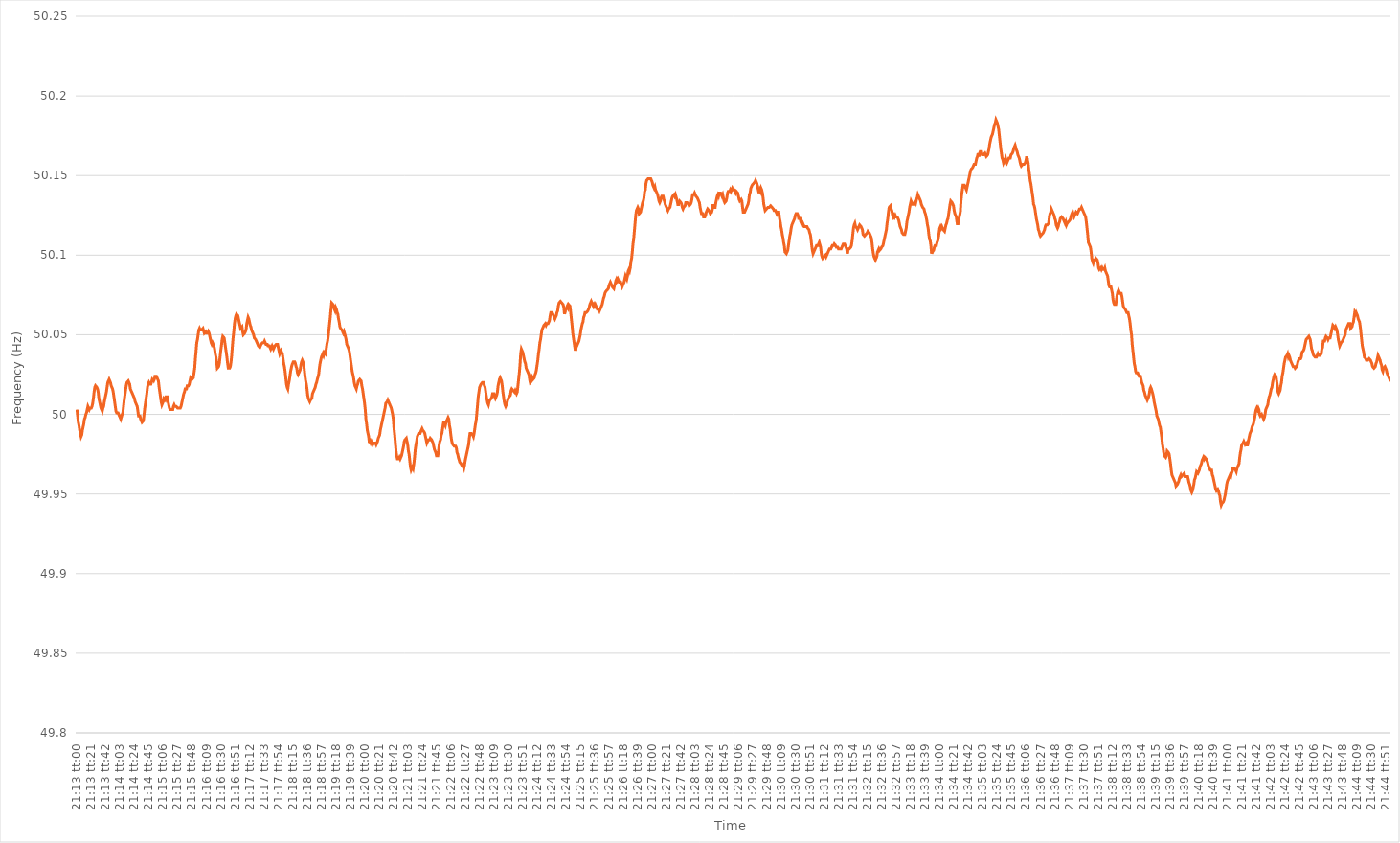
| Category | Series 0 |
|---|---|
| 0.8840277777777777 | 50.003 |
| 0.8840393518518518 | 49.999 |
| 0.8840509259259259 | 49.995 |
| 0.8840625000000001 | 49.993 |
| 0.884074074074074 | 49.99 |
| 0.8840856481481482 | 49.988 |
| 0.8840972222222222 | 49.986 |
| 0.8841087962962964 | 49.987 |
| 0.8841203703703703 | 49.99 |
| 0.8841319444444444 | 49.992 |
| 0.8841435185185186 | 49.994 |
| 0.8841550925925926 | 49.997 |
| 0.8841666666666667 | 49.998 |
| 0.8841782407407407 | 50 |
| 0.8841898148148148 | 50.001 |
| 0.884201388888889 | 50.003 |
| 0.8842129629629629 | 50.005 |
| 0.8842245370370371 | 50.005 |
| 0.8842361111111111 | 50.003 |
| 0.8842476851851852 | 50.004 |
| 0.8842592592592592 | 50.004 |
| 0.8842708333333333 | 50.004 |
| 0.8842824074074075 | 50.005 |
| 0.8842939814814814 | 50.007 |
| 0.8843055555555556 | 50.01 |
| 0.8843171296296296 | 50.014 |
| 0.8843287037037038 | 50.017 |
| 0.8843402777777777 | 50.018 |
| 0.8843518518518518 | 50.018 |
| 0.884363425925926 | 50.017 |
| 0.884375 | 50.016 |
| 0.8843865740740741 | 50.014 |
| 0.8843981481481481 | 50.01 |
| 0.8844097222222222 | 50.008 |
| 0.8844212962962964 | 50.006 |
| 0.8844328703703703 | 50.004 |
| 0.8844444444444445 | 50.003 |
| 0.8844560185185185 | 50.002 |
| 0.8844675925925927 | 50.004 |
| 0.8844791666666666 | 50.005 |
| 0.8844907407407407 | 50.008 |
| 0.8845023148148149 | 50.01 |
| 0.8845138888888888 | 50.012 |
| 0.884525462962963 | 50.014 |
| 0.884537037037037 | 50.017 |
| 0.8845486111111112 | 50.02 |
| 0.8845601851851851 | 50.021 |
| 0.8845717592592592 | 50.022 |
| 0.8845833333333334 | 50.021 |
| 0.8845949074074074 | 50.02 |
| 0.8846064814814815 | 50.018 |
| 0.8846180555555555 | 50.017 |
| 0.8846296296296297 | 50.016 |
| 0.8846412037037038 | 50.014 |
| 0.8846527777777777 | 50.011 |
| 0.8846643518518519 | 50.008 |
| 0.8846759259259259 | 50.005 |
| 0.8846875000000001 | 50.002 |
| 0.884699074074074 | 50.001 |
| 0.8847106481481481 | 50.001 |
| 0.8847222222222223 | 50.001 |
| 0.8847337962962962 | 50.001 |
| 0.8847453703703704 | 49.999 |
| 0.8847569444444444 | 49.998 |
| 0.8847685185185186 | 49.997 |
| 0.8847800925925925 | 49.997 |
| 0.8847916666666666 | 50 |
| 0.8848032407407408 | 50.001 |
| 0.8848148148148148 | 50.005 |
| 0.8848263888888889 | 50.009 |
| 0.8848379629629629 | 50.012 |
| 0.8848495370370371 | 50.015 |
| 0.8848611111111112 | 50.018 |
| 0.8848726851851851 | 50.02 |
| 0.8848842592592593 | 50.02 |
| 0.8848958333333333 | 50.021 |
| 0.8849074074074075 | 50.021 |
| 0.8849189814814814 | 50.019 |
| 0.8849305555555556 | 50.016 |
| 0.8849421296296297 | 50.015 |
| 0.8849537037037036 | 50.014 |
| 0.8849652777777778 | 50.014 |
| 0.8849768518518518 | 50.012 |
| 0.884988425925926 | 50.011 |
| 0.8849999999999999 | 50.01 |
| 0.885011574074074 | 50.008 |
| 0.8850231481481482 | 50.008 |
| 0.8850347222222222 | 50.006 |
| 0.8850462962962963 | 50.005 |
| 0.8850578703703703 | 50.002 |
| 0.8850694444444445 | 49.999 |
| 0.8850810185185186 | 49.999 |
| 0.8850925925925925 | 49.999 |
| 0.8851041666666667 | 49.997 |
| 0.8851157407407407 | 49.996 |
| 0.8851273148148149 | 49.995 |
| 0.8851388888888888 | 49.995 |
| 0.885150462962963 | 49.996 |
| 0.8851620370370371 | 50 |
| 0.8851736111111111 | 50.004 |
| 0.8851851851851852 | 50.007 |
| 0.8851967592592592 | 50.01 |
| 0.8852083333333334 | 50.013 |
| 0.8852199074074073 | 50.017 |
| 0.8852314814814815 | 50.019 |
| 0.8852430555555556 | 50.02 |
| 0.8852546296296296 | 50.019 |
| 0.8852662037037037 | 50.019 |
| 0.8852777777777777 | 50.019 |
| 0.8852893518518519 | 50.019 |
| 0.885300925925926 | 50.022 |
| 0.8853125 | 50.022 |
| 0.8853240740740741 | 50.021 |
| 0.8853356481481481 | 50.022 |
| 0.8853472222222223 | 50.024 |
| 0.8853587962962962 | 50.024 |
| 0.8853703703703704 | 50.024 |
| 0.8853819444444445 | 50.023 |
| 0.8853935185185186 | 50.023 |
| 0.8854050925925926 | 50.021 |
| 0.8854166666666666 | 50.017 |
| 0.8854282407407408 | 50.014 |
| 0.8854398148148147 | 50.011 |
| 0.8854513888888889 | 50.008 |
| 0.885462962962963 | 50.006 |
| 0.885474537037037 | 50.006 |
| 0.8854861111111111 | 50.008 |
| 0.8854976851851851 | 50.01 |
| 0.8855092592592593 | 50.01 |
| 0.8855208333333334 | 50.009 |
| 0.8855324074074074 | 50.011 |
| 0.8855439814814815 | 50.011 |
| 0.8855555555555555 | 50.011 |
| 0.8855671296296297 | 50.008 |
| 0.8855787037037036 | 50.006 |
| 0.8855902777777778 | 50.004 |
| 0.8856018518518519 | 50.003 |
| 0.885613425925926 | 50.003 |
| 0.885625 | 50.003 |
| 0.885636574074074 | 50.003 |
| 0.8856481481481482 | 50.003 |
| 0.8856597222222221 | 50.005 |
| 0.8856712962962963 | 50.006 |
| 0.8856828703703704 | 50.005 |
| 0.8856944444444445 | 50.005 |
| 0.8857060185185185 | 50.005 |
| 0.8857175925925925 | 50.005 |
| 0.8857291666666667 | 50.004 |
| 0.8857407407407408 | 50.004 |
| 0.8857523148148148 | 50.004 |
| 0.8857638888888889 | 50.004 |
| 0.885775462962963 | 50.004 |
| 0.8857870370370371 | 50.005 |
| 0.885798611111111 | 50.007 |
| 0.8858101851851852 | 50.009 |
| 0.8858217592592593 | 50.011 |
| 0.8858333333333334 | 50.013 |
| 0.8858449074074074 | 50.014 |
| 0.8858564814814814 | 50.016 |
| 0.8858680555555556 | 50.016 |
| 0.8858796296296297 | 50.016 |
| 0.8858912037037037 | 50.018 |
| 0.8859027777777778 | 50.018 |
| 0.8859143518518519 | 50.018 |
| 0.8859259259259259 | 50.019 |
| 0.8859374999999999 | 50.021 |
| 0.8859490740740741 | 50.023 |
| 0.8859606481481482 | 50.023 |
| 0.8859722222222222 | 50.022 |
| 0.8859837962962963 | 50.022 |
| 0.8859953703703703 | 50.023 |
| 0.8860069444444445 | 50.026 |
| 0.8860185185185184 | 50.029 |
| 0.8860300925925926 | 50.035 |
| 0.8860416666666667 | 50.04 |
| 0.8860532407407408 | 50.045 |
| 0.8860648148148148 | 50.047 |
| 0.8860763888888888 | 50.05 |
| 0.886087962962963 | 50.053 |
| 0.8860995370370371 | 50.054 |
| 0.8861111111111111 | 50.053 |
| 0.8861226851851852 | 50.053 |
| 0.8861342592592593 | 50.053 |
| 0.8861458333333333 | 50.053 |
| 0.8861574074074073 | 50.054 |
| 0.8861689814814815 | 50.054 |
| 0.8861805555555556 | 50.051 |
| 0.8861921296296296 | 50.051 |
| 0.8862037037037037 | 50.052 |
| 0.8862152777777778 | 50.051 |
| 0.8862268518518519 | 50.051 |
| 0.8862384259259258 | 50.051 |
| 0.88625 | 50.052 |
| 0.8862615740740741 | 50.051 |
| 0.8862731481481482 | 50.049 |
| 0.8862847222222222 | 50.047 |
| 0.8862962962962962 | 50.045 |
| 0.8863078703703704 | 50.044 |
| 0.8863194444444445 | 50.045 |
| 0.8863310185185185 | 50.044 |
| 0.8863425925925926 | 50.043 |
| 0.8863541666666667 | 50.041 |
| 0.8863657407407407 | 50.038 |
| 0.8863773148148147 | 50.036 |
| 0.8863888888888889 | 50.033 |
| 0.886400462962963 | 50.029 |
| 0.886412037037037 | 50.029 |
| 0.8864236111111111 | 50.03 |
| 0.8864351851851852 | 50.032 |
| 0.8864467592592593 | 50.036 |
| 0.8864583333333332 | 50.04 |
| 0.8864699074074074 | 50.043 |
| 0.8864814814814815 | 50.047 |
| 0.8864930555555556 | 50.049 |
| 0.8865046296296296 | 50.049 |
| 0.8865162037037037 | 50.048 |
| 0.8865277777777778 | 50.045 |
| 0.886539351851852 | 50.042 |
| 0.8865509259259259 | 50.039 |
| 0.8865625 | 50.036 |
| 0.8865740740740741 | 50.032 |
| 0.8865856481481482 | 50.029 |
| 0.8865972222222221 | 50.029 |
| 0.8866087962962963 | 50.029 |
| 0.8866203703703704 | 50.03 |
| 0.8866319444444444 | 50.033 |
| 0.8866435185185185 | 50.037 |
| 0.8866550925925926 | 50.043 |
| 0.8866666666666667 | 50.048 |
| 0.8866782407407406 | 50.052 |
| 0.8866898148148148 | 50.057 |
| 0.8867013888888889 | 50.06 |
| 0.886712962962963 | 50.062 |
| 0.886724537037037 | 50.063 |
| 0.8867361111111111 | 50.063 |
| 0.8867476851851852 | 50.062 |
| 0.8867592592592594 | 50.06 |
| 0.8867708333333333 | 50.058 |
| 0.8867824074074074 | 50.056 |
| 0.8867939814814815 | 50.054 |
| 0.8868055555555556 | 50.054 |
| 0.8868171296296296 | 50.055 |
| 0.8868287037037037 | 50.052 |
| 0.8868402777777779 | 50.05 |
| 0.8868518518518518 | 50.05 |
| 0.8868634259259259 | 50.051 |
| 0.886875 | 50.051 |
| 0.8868865740740741 | 50.053 |
| 0.886898148148148 | 50.057 |
| 0.8869097222222222 | 50.059 |
| 0.8869212962962963 | 50.061 |
| 0.8869328703703704 | 50.06 |
| 0.8869444444444444 | 50.058 |
| 0.8869560185185185 | 50.056 |
| 0.8869675925925926 | 50.055 |
| 0.8869791666666668 | 50.053 |
| 0.8869907407407407 | 50.052 |
| 0.8870023148148148 | 50.051 |
| 0.8870138888888889 | 50.05 |
| 0.887025462962963 | 50.048 |
| 0.887037037037037 | 50.048 |
| 0.8870486111111111 | 50.047 |
| 0.8870601851851853 | 50.046 |
| 0.8870717592592593 | 50.046 |
| 0.8870833333333333 | 50.044 |
| 0.8870949074074074 | 50.043 |
| 0.8871064814814815 | 50.043 |
| 0.8871180555555555 | 50.042 |
| 0.8871296296296296 | 50.043 |
| 0.8871412037037038 | 50.044 |
| 0.8871527777777778 | 50.044 |
| 0.8871643518518518 | 50.045 |
| 0.8871759259259259 | 50.045 |
| 0.8871875 | 50.045 |
| 0.8871990740740742 | 50.046 |
| 0.8872106481481481 | 50.045 |
| 0.8872222222222222 | 50.044 |
| 0.8872337962962963 | 50.044 |
| 0.8872453703703704 | 50.044 |
| 0.8872569444444444 | 50.043 |
| 0.8872685185185185 | 50.043 |
| 0.8872800925925927 | 50.043 |
| 0.8872916666666667 | 50.043 |
| 0.8873032407407407 | 50.041 |
| 0.8873148148148148 | 50.041 |
| 0.8873263888888889 | 50.043 |
| 0.8873379629629629 | 50.042 |
| 0.887349537037037 | 50.041 |
| 0.8873611111111112 | 50.042 |
| 0.8873726851851852 | 50.043 |
| 0.8873842592592592 | 50.043 |
| 0.8873958333333333 | 50.044 |
| 0.8874074074074074 | 50.044 |
| 0.8874189814814816 | 50.044 |
| 0.8874305555555555 | 50.042 |
| 0.8874421296296297 | 50.04 |
| 0.8874537037037037 | 50.038 |
| 0.8874652777777778 | 50.039 |
| 0.8874768518518518 | 50.04 |
| 0.8874884259259259 | 50.04 |
| 0.8875000000000001 | 50.038 |
| 0.8875115740740741 | 50.035 |
| 0.8875231481481481 | 50.032 |
| 0.8875347222222222 | 50.03 |
| 0.8875462962962963 | 50.027 |
| 0.8875578703703703 | 50.023 |
| 0.8875694444444444 | 50.019 |
| 0.8875810185185186 | 50.017 |
| 0.8875925925925926 | 50.016 |
| 0.8876041666666666 | 50.019 |
| 0.8876157407407407 | 50.021 |
| 0.8876273148148148 | 50.024 |
| 0.887638888888889 | 50.027 |
| 0.8876504629629629 | 50.029 |
| 0.887662037037037 | 50.031 |
| 0.8876736111111111 | 50.032 |
| 0.8876851851851852 | 50.033 |
| 0.8876967592592592 | 50.033 |
| 0.8877083333333333 | 50.033 |
| 0.8877199074074075 | 50.032 |
| 0.8877314814814815 | 50.03 |
| 0.8877430555555555 | 50.029 |
| 0.8877546296296296 | 50.026 |
| 0.8877662037037037 | 50.025 |
| 0.8877777777777777 | 50.025 |
| 0.8877893518518518 | 50.027 |
| 0.887800925925926 | 50.028 |
| 0.8878125 | 50.031 |
| 0.887824074074074 | 50.033 |
| 0.8878356481481481 | 50.034 |
| 0.8878472222222222 | 50.034 |
| 0.8878587962962964 | 50.032 |
| 0.8878703703703703 | 50.028 |
| 0.8878819444444445 | 50.024 |
| 0.8878935185185185 | 50.021 |
| 0.8879050925925926 | 50.019 |
| 0.8879166666666666 | 50.016 |
| 0.8879282407407407 | 50.012 |
| 0.8879398148148149 | 50.01 |
| 0.8879513888888889 | 50.009 |
| 0.887962962962963 | 50.008 |
| 0.887974537037037 | 50.009 |
| 0.8879861111111111 | 50.009 |
| 0.8879976851851853 | 50.01 |
| 0.8880092592592592 | 50.013 |
| 0.8880208333333334 | 50.013 |
| 0.8880324074074074 | 50.015 |
| 0.8880439814814814 | 50.016 |
| 0.8880555555555555 | 50.017 |
| 0.8880671296296296 | 50.019 |
| 0.8880787037037038 | 50.02 |
| 0.8880902777777777 | 50.022 |
| 0.8881018518518519 | 50.022 |
| 0.8881134259259259 | 50.025 |
| 0.888125 | 50.029 |
| 0.888136574074074 | 50.032 |
| 0.8881481481481481 | 50.034 |
| 0.8881597222222223 | 50.036 |
| 0.8881712962962963 | 50.037 |
| 0.8881828703703704 | 50.038 |
| 0.8881944444444444 | 50.037 |
| 0.8882060185185185 | 50.039 |
| 0.8882175925925927 | 50.039 |
| 0.8882291666666666 | 50.038 |
| 0.8882407407407408 | 50.041 |
| 0.8882523148148148 | 50.044 |
| 0.888263888888889 | 50.046 |
| 0.8882754629629629 | 50.049 |
| 0.888287037037037 | 50.053 |
| 0.8882986111111112 | 50.057 |
| 0.8883101851851851 | 50.061 |
| 0.8883217592592593 | 50.066 |
| 0.8883333333333333 | 50.07 |
| 0.8883449074074075 | 50.07 |
| 0.8883564814814814 | 50.069 |
| 0.8883680555555555 | 50.068 |
| 0.8883796296296297 | 50.066 |
| 0.8883912037037037 | 50.065 |
| 0.8884027777777778 | 50.067 |
| 0.8884143518518518 | 50.066 |
| 0.888425925925926 | 50.064 |
| 0.8884375000000001 | 50.063 |
| 0.888449074074074 | 50.06 |
| 0.8884606481481482 | 50.058 |
| 0.8884722222222222 | 50.055 |
| 0.8884837962962964 | 50.054 |
| 0.8884953703703703 | 50.054 |
| 0.8885069444444444 | 50.053 |
| 0.8885185185185186 | 50.052 |
| 0.8885300925925925 | 50.051 |
| 0.8885416666666667 | 50.052 |
| 0.8885532407407407 | 50.052 |
| 0.8885648148148149 | 50.049 |
| 0.8885763888888888 | 50.047 |
| 0.8885879629629629 | 50.044 |
| 0.8885995370370371 | 50.043 |
| 0.8886111111111111 | 50.042 |
| 0.8886226851851852 | 50.041 |
| 0.8886342592592592 | 50.039 |
| 0.8886458333333334 | 50.036 |
| 0.8886574074074075 | 50.033 |
| 0.8886689814814814 | 50.03 |
| 0.8886805555555556 | 50.027 |
| 0.8886921296296296 | 50.025 |
| 0.8887037037037038 | 50.023 |
| 0.8887152777777777 | 50.02 |
| 0.8887268518518519 | 50.018 |
| 0.888738425925926 | 50.017 |
| 0.8887499999999999 | 50.016 |
| 0.8887615740740741 | 50.018 |
| 0.8887731481481481 | 50.019 |
| 0.8887847222222223 | 50.021 |
| 0.8887962962962962 | 50.021 |
| 0.8888078703703703 | 50.022 |
| 0.8888194444444445 | 50.022 |
| 0.8888310185185185 | 50.021 |
| 0.8888425925925926 | 50.018 |
| 0.8888541666666666 | 50.016 |
| 0.8888657407407408 | 50.013 |
| 0.8888773148148149 | 50.01 |
| 0.8888888888888888 | 50.007 |
| 0.888900462962963 | 50.003 |
| 0.888912037037037 | 49.997 |
| 0.8889236111111112 | 49.994 |
| 0.8889351851851851 | 49.99 |
| 0.8889467592592593 | 49.988 |
| 0.8889583333333334 | 49.986 |
| 0.8889699074074073 | 49.982 |
| 0.8889814814814815 | 49.983 |
| 0.8889930555555555 | 49.982 |
| 0.8890046296296297 | 49.983 |
| 0.8890162037037036 | 49.982 |
| 0.8890277777777778 | 49.981 |
| 0.8890393518518519 | 49.981 |
| 0.8890509259259259 | 49.982 |
| 0.8890625 | 49.982 |
| 0.889074074074074 | 49.982 |
| 0.8890856481481482 | 49.981 |
| 0.8890972222222223 | 49.982 |
| 0.8891087962962962 | 49.983 |
| 0.8891203703703704 | 49.985 |
| 0.8891319444444444 | 49.986 |
| 0.8891435185185186 | 49.987 |
| 0.8891550925925925 | 49.99 |
| 0.8891666666666667 | 49.992 |
| 0.8891782407407408 | 49.994 |
| 0.8891898148148148 | 49.996 |
| 0.8892013888888889 | 49.998 |
| 0.8892129629629629 | 50 |
| 0.8892245370370371 | 50.002 |
| 0.889236111111111 | 50.004 |
| 0.8892476851851852 | 50.007 |
| 0.8892592592592593 | 50.007 |
| 0.8892708333333333 | 50.008 |
| 0.8892824074074074 | 50.009 |
| 0.8892939814814814 | 50.008 |
| 0.8893055555555556 | 50.007 |
| 0.8893171296296297 | 50.006 |
| 0.8893287037037036 | 50.005 |
| 0.8893402777777778 | 50.004 |
| 0.8893518518518518 | 50.002 |
| 0.889363425925926 | 50 |
| 0.8893749999999999 | 49.997 |
| 0.8893865740740741 | 49.991 |
| 0.8893981481481482 | 49.987 |
| 0.8894097222222223 | 49.982 |
| 0.8894212962962963 | 49.977 |
| 0.8894328703703703 | 49.974 |
| 0.8894444444444445 | 49.972 |
| 0.8894560185185184 | 49.972 |
| 0.8894675925925926 | 49.972 |
| 0.8894791666666667 | 49.973 |
| 0.8894907407407407 | 49.972 |
| 0.8895023148148148 | 49.973 |
| 0.8895138888888888 | 49.974 |
| 0.889525462962963 | 49.976 |
| 0.8895370370370371 | 49.978 |
| 0.889548611111111 | 49.98 |
| 0.8895601851851852 | 49.983 |
| 0.8895717592592592 | 49.984 |
| 0.8895833333333334 | 49.984 |
| 0.8895949074074073 | 49.985 |
| 0.8896064814814815 | 49.983 |
| 0.8896180555555556 | 49.981 |
| 0.8896296296296297 | 49.977 |
| 0.8896412037037037 | 49.975 |
| 0.8896527777777777 | 49.971 |
| 0.8896643518518519 | 49.967 |
| 0.889675925925926 | 49.965 |
| 0.8896875 | 49.965 |
| 0.8896990740740741 | 49.967 |
| 0.8897106481481482 | 49.966 |
| 0.8897222222222222 | 49.969 |
| 0.8897337962962962 | 49.973 |
| 0.8897453703703704 | 49.978 |
| 0.8897569444444445 | 49.981 |
| 0.8897685185185185 | 49.983 |
| 0.8897800925925926 | 49.986 |
| 0.8897916666666666 | 49.987 |
| 0.8898032407407408 | 49.988 |
| 0.8898148148148147 | 49.988 |
| 0.8898263888888889 | 49.988 |
| 0.889837962962963 | 49.988 |
| 0.8898495370370371 | 49.99 |
| 0.8898611111111111 | 49.991 |
| 0.8898726851851851 | 49.99 |
| 0.8898842592592593 | 49.99 |
| 0.8898958333333334 | 49.989 |
| 0.8899074074074074 | 49.988 |
| 0.8899189814814815 | 49.986 |
| 0.8899305555555556 | 49.984 |
| 0.8899421296296296 | 49.982 |
| 0.8899537037037036 | 49.983 |
| 0.8899652777777778 | 49.984 |
| 0.8899768518518519 | 49.984 |
| 0.8899884259259259 | 49.984 |
| 0.89 | 49.985 |
| 0.890011574074074 | 49.985 |
| 0.8900231481481482 | 49.984 |
| 0.8900347222222221 | 49.983 |
| 0.8900462962962963 | 49.982 |
| 0.8900578703703704 | 49.98 |
| 0.8900694444444445 | 49.978 |
| 0.8900810185185185 | 49.977 |
| 0.8900925925925925 | 49.976 |
| 0.8901041666666667 | 49.974 |
| 0.8901157407407408 | 49.974 |
| 0.8901273148148148 | 49.974 |
| 0.8901388888888889 | 49.977 |
| 0.890150462962963 | 49.981 |
| 0.890162037037037 | 49.983 |
| 0.890173611111111 | 49.984 |
| 0.8901851851851852 | 49.987 |
| 0.8901967592592593 | 49.988 |
| 0.8902083333333333 | 49.991 |
| 0.8902199074074074 | 49.994 |
| 0.8902314814814815 | 49.996 |
| 0.8902430555555556 | 49.994 |
| 0.8902546296296295 | 49.993 |
| 0.8902662037037037 | 49.995 |
| 0.8902777777777778 | 49.995 |
| 0.8902893518518519 | 49.997 |
| 0.8903009259259259 | 49.998 |
| 0.8903125 | 49.997 |
| 0.8903240740740741 | 49.993 |
| 0.8903356481481483 | 49.991 |
| 0.8903472222222222 | 49.987 |
| 0.8903587962962963 | 49.984 |
| 0.8903703703703704 | 49.982 |
| 0.8903819444444444 | 49.981 |
| 0.8903935185185184 | 49.981 |
| 0.8904050925925926 | 49.98 |
| 0.8904166666666667 | 49.98 |
| 0.8904282407407407 | 49.98 |
| 0.8904398148148148 | 49.979 |
| 0.8904513888888889 | 49.976 |
| 0.890462962962963 | 49.975 |
| 0.8904745370370369 | 49.973 |
| 0.8904861111111111 | 49.973 |
| 0.8904976851851852 | 49.97 |
| 0.8905092592592593 | 49.97 |
| 0.8905208333333333 | 49.969 |
| 0.8905324074074074 | 49.968 |
| 0.8905439814814815 | 49.968 |
| 0.8905555555555557 | 49.967 |
| 0.8905671296296296 | 49.966 |
| 0.8905787037037037 | 49.968 |
| 0.8905902777777778 | 49.971 |
| 0.8906018518518519 | 49.973 |
| 0.8906134259259259 | 49.975 |
| 0.890625 | 49.977 |
| 0.8906365740740741 | 49.979 |
| 0.8906481481481481 | 49.981 |
| 0.8906597222222222 | 49.985 |
| 0.8906712962962963 | 49.988 |
| 0.8906828703703704 | 49.988 |
| 0.8906944444444443 | 49.988 |
| 0.8907060185185185 | 49.988 |
| 0.8907175925925926 | 49.987 |
| 0.8907291666666667 | 49.986 |
| 0.8907407407407407 | 49.988 |
| 0.8907523148148148 | 49.991 |
| 0.8907638888888889 | 49.994 |
| 0.8907754629629631 | 49.996 |
| 0.890787037037037 | 50.001 |
| 0.8907986111111111 | 50.006 |
| 0.8908101851851852 | 50.011 |
| 0.8908217592592593 | 50.014 |
| 0.8908333333333333 | 50.017 |
| 0.8908449074074074 | 50.017 |
| 0.8908564814814816 | 50.019 |
| 0.8908680555555556 | 50.019 |
| 0.8908796296296296 | 50.02 |
| 0.8908912037037037 | 50.02 |
| 0.8909027777777778 | 50.02 |
| 0.8909143518518517 | 50.018 |
| 0.8909259259259259 | 50.017 |
| 0.8909375 | 50.014 |
| 0.8909490740740741 | 50.011 |
| 0.8909606481481481 | 50.009 |
| 0.8909722222222222 | 50.007 |
| 0.8909837962962963 | 50.006 |
| 0.8909953703703705 | 50.008 |
| 0.8910069444444444 | 50.009 |
| 0.8910185185185185 | 50.009 |
| 0.8910300925925926 | 50.01 |
| 0.8910416666666667 | 50.011 |
| 0.8910532407407407 | 50.013 |
| 0.8910648148148148 | 50.013 |
| 0.891076388888889 | 50.013 |
| 0.891087962962963 | 50.011 |
| 0.891099537037037 | 50.01 |
| 0.8911111111111111 | 50.01 |
| 0.8911226851851852 | 50.012 |
| 0.8911342592592592 | 50.014 |
| 0.8911458333333333 | 50.018 |
| 0.8911574074074075 | 50.02 |
| 0.8911689814814815 | 50.022 |
| 0.8911805555555555 | 50.023 |
| 0.8911921296296296 | 50.023 |
| 0.8912037037037037 | 50.021 |
| 0.8912152777777779 | 50.018 |
| 0.8912268518518518 | 50.014 |
| 0.891238425925926 | 50.011 |
| 0.89125 | 50.008 |
| 0.8912615740740741 | 50.006 |
| 0.8912731481481481 | 50.005 |
| 0.8912847222222222 | 50.005 |
| 0.8912962962962964 | 50.007 |
| 0.8913078703703704 | 50.009 |
| 0.8913194444444444 | 50.01 |
| 0.8913310185185185 | 50.011 |
| 0.8913425925925926 | 50.011 |
| 0.8913541666666666 | 50.012 |
| 0.8913657407407407 | 50.015 |
| 0.8913773148148149 | 50.016 |
| 0.8913888888888889 | 50.016 |
| 0.8914004629629629 | 50.015 |
| 0.891412037037037 | 50.015 |
| 0.8914236111111111 | 50.014 |
| 0.8914351851851853 | 50.015 |
| 0.8914467592592592 | 50.014 |
| 0.8914583333333334 | 50.013 |
| 0.8914699074074074 | 50.014 |
| 0.8914814814814815 | 50.018 |
| 0.8914930555555555 | 50.022 |
| 0.8915046296296296 | 50.026 |
| 0.8915162037037038 | 50.031 |
| 0.8915277777777778 | 50.038 |
| 0.8915393518518518 | 50.041 |
| 0.8915509259259259 | 50.041 |
| 0.8915625 | 50.039 |
| 0.891574074074074 | 50.037 |
| 0.8915856481481481 | 50.035 |
| 0.8915972222222223 | 50.033 |
| 0.8916087962962963 | 50.032 |
| 0.8916203703703703 | 50.029 |
| 0.8916319444444444 | 50.028 |
| 0.8916435185185185 | 50.027 |
| 0.8916550925925927 | 50.027 |
| 0.8916666666666666 | 50.025 |
| 0.8916782407407408 | 50.022 |
| 0.8916898148148148 | 50.02 |
| 0.891701388888889 | 50.02 |
| 0.8917129629629629 | 50.021 |
| 0.891724537037037 | 50.023 |
| 0.8917361111111112 | 50.022 |
| 0.8917476851851852 | 50.022 |
| 0.8917592592592593 | 50.023 |
| 0.8917708333333333 | 50.025 |
| 0.8917824074074074 | 50.026 |
| 0.8917939814814816 | 50.028 |
| 0.8918055555555555 | 50.031 |
| 0.8918171296296297 | 50.034 |
| 0.8918287037037037 | 50.038 |
| 0.8918402777777777 | 50.041 |
| 0.8918518518518518 | 50.045 |
| 0.8918634259259259 | 50.047 |
| 0.8918750000000001 | 50.05 |
| 0.891886574074074 | 50.053 |
| 0.8918981481481482 | 50.053 |
| 0.8919097222222222 | 50.055 |
| 0.8919212962962964 | 50.056 |
| 0.8919328703703703 | 50.056 |
| 0.8919444444444444 | 50.057 |
| 0.8919560185185186 | 50.056 |
| 0.8919675925925926 | 50.057 |
| 0.8919791666666667 | 50.057 |
| 0.8919907407407407 | 50.057 |
| 0.8920023148148148 | 50.058 |
| 0.892013888888889 | 50.059 |
| 0.8920254629629629 | 50.062 |
| 0.8920370370370371 | 50.064 |
| 0.8920486111111111 | 50.064 |
| 0.8920601851851852 | 50.064 |
| 0.8920717592592592 | 50.063 |
| 0.8920833333333333 | 50.062 |
| 0.8920949074074075 | 50.061 |
| 0.8921064814814814 | 50.06 |
| 0.8921180555555556 | 50.061 |
| 0.8921296296296296 | 50.062 |
| 0.8921412037037038 | 50.064 |
| 0.8921527777777777 | 50.065 |
| 0.8921643518518518 | 50.068 |
| 0.892175925925926 | 50.07 |
| 0.8921875 | 50.07 |
| 0.8921990740740741 | 50.071 |
| 0.8922106481481481 | 50.071 |
| 0.8922222222222222 | 50.07 |
| 0.8922337962962964 | 50.07 |
| 0.8922453703703703 | 50.069 |
| 0.8922569444444445 | 50.067 |
| 0.8922685185185185 | 50.063 |
| 0.8922800925925927 | 50.065 |
| 0.8922916666666666 | 50.065 |
| 0.8923032407407407 | 50.067 |
| 0.8923148148148149 | 50.068 |
| 0.8923263888888888 | 50.067 |
| 0.892337962962963 | 50.069 |
| 0.892349537037037 | 50.069 |
| 0.8923611111111112 | 50.068 |
| 0.8923726851851851 | 50.064 |
| 0.8923842592592592 | 50.06 |
| 0.8923958333333334 | 50.056 |
| 0.8924074074074074 | 50.051 |
| 0.8924189814814815 | 50.048 |
| 0.8924305555555555 | 50.045 |
| 0.8924421296296297 | 50.042 |
| 0.8924537037037038 | 50.04 |
| 0.8924652777777777 | 50.042 |
| 0.8924768518518519 | 50.043 |
| 0.8924884259259259 | 50.044 |
| 0.8925000000000001 | 50.044 |
| 0.892511574074074 | 50.046 |
| 0.8925231481481481 | 50.048 |
| 0.8925347222222223 | 50.05 |
| 0.8925462962962962 | 50.053 |
| 0.8925578703703704 | 50.055 |
| 0.8925694444444444 | 50.057 |
| 0.8925810185185186 | 50.058 |
| 0.8925925925925925 | 50.061 |
| 0.8926041666666666 | 50.062 |
| 0.8926157407407408 | 50.064 |
| 0.8926273148148148 | 50.064 |
| 0.8926388888888889 | 50.064 |
| 0.8926504629629629 | 50.064 |
| 0.8926620370370371 | 50.065 |
| 0.8926736111111112 | 50.065 |
| 0.8926851851851851 | 50.067 |
| 0.8926967592592593 | 50.069 |
| 0.8927083333333333 | 50.07 |
| 0.8927199074074075 | 50.071 |
| 0.8927314814814814 | 50.07 |
| 0.8927430555555556 | 50.069 |
| 0.8927546296296297 | 50.068 |
| 0.8927662037037036 | 50.069 |
| 0.8927777777777778 | 50.068 |
| 0.8927893518518518 | 50.069 |
| 0.892800925925926 | 50.068 |
| 0.8928124999999999 | 50.068 |
| 0.892824074074074 | 50.066 |
| 0.8928356481481482 | 50.066 |
| 0.8928472222222222 | 50.066 |
| 0.8928587962962963 | 50.065 |
| 0.8928703703703703 | 50.066 |
| 0.8928819444444445 | 50.067 |
| 0.8928935185185186 | 50.068 |
| 0.8929050925925925 | 50.069 |
| 0.8929166666666667 | 50.071 |
| 0.8929282407407407 | 50.073 |
| 0.8929398148148149 | 50.074 |
| 0.8929513888888888 | 50.076 |
| 0.892962962962963 | 50.077 |
| 0.8929745370370371 | 50.077 |
| 0.892986111111111 | 50.078 |
| 0.8929976851851852 | 50.078 |
| 0.8930092592592592 | 50.079 |
| 0.8930208333333334 | 50.081 |
| 0.8930324074074073 | 50.082 |
| 0.8930439814814815 | 50.083 |
| 0.8930555555555556 | 50.082 |
| 0.8930671296296296 | 50.081 |
| 0.8930787037037037 | 50.08 |
| 0.8930902777777777 | 50.08 |
| 0.8931018518518519 | 50.079 |
| 0.893113425925926 | 50.081 |
| 0.893125 | 50.082 |
| 0.8931365740740741 | 50.084 |
| 0.8931481481481481 | 50.085 |
| 0.8931597222222223 | 50.084 |
| 0.8931712962962962 | 50.085 |
| 0.8931828703703704 | 50.084 |
| 0.8931944444444445 | 50.083 |
| 0.8932060185185186 | 50.083 |
| 0.8932175925925926 | 50.083 |
| 0.8932291666666666 | 50.081 |
| 0.8932407407407408 | 50.08 |
| 0.8932523148148147 | 50.081 |
| 0.8932638888888889 | 50.081 |
| 0.893275462962963 | 50.083 |
| 0.893287037037037 | 50.085 |
| 0.8932986111111111 | 50.087 |
| 0.8933101851851851 | 50.086 |
| 0.8933217592592593 | 50.085 |
| 0.8933333333333334 | 50.087 |
| 0.8933449074074074 | 50.09 |
| 0.8933564814814815 | 50.091 |
| 0.8933680555555555 | 50.09 |
| 0.8933796296296297 | 50.092 |
| 0.8933912037037036 | 50.096 |
| 0.8934027777777778 | 50.098 |
| 0.8934143518518519 | 50.102 |
| 0.893425925925926 | 50.107 |
| 0.8934375 | 50.11 |
| 0.893449074074074 | 50.115 |
| 0.8934606481481482 | 50.12 |
| 0.8934722222222223 | 50.125 |
| 0.8934837962962963 | 50.128 |
| 0.8934953703703704 | 50.129 |
| 0.8935069444444445 | 50.13 |
| 0.8935185185185185 | 50.129 |
| 0.8935300925925925 | 50.126 |
| 0.8935416666666667 | 50.126 |
| 0.8935532407407408 | 50.127 |
| 0.8935648148148148 | 50.127 |
| 0.8935763888888889 | 50.131 |
| 0.893587962962963 | 50.133 |
| 0.8935995370370371 | 50.134 |
| 0.893611111111111 | 50.136 |
| 0.8936226851851852 | 50.14 |
| 0.8936342592592593 | 50.141 |
| 0.8936458333333334 | 50.145 |
| 0.8936574074074074 | 50.147 |
| 0.8936689814814814 | 50.147 |
| 0.8936805555555556 | 50.148 |
| 0.8936921296296297 | 50.148 |
| 0.8937037037037037 | 50.148 |
| 0.8937152777777778 | 50.148 |
| 0.8937268518518519 | 50.148 |
| 0.8937384259259259 | 50.147 |
| 0.8937499999999999 | 50.146 |
| 0.8937615740740741 | 50.144 |
| 0.8937731481481482 | 50.143 |
| 0.8937847222222222 | 50.142 |
| 0.8937962962962963 | 50.143 |
| 0.8938078703703703 | 50.141 |
| 0.8938194444444445 | 50.14 |
| 0.8938310185185184 | 50.14 |
| 0.8938425925925926 | 50.138 |
| 0.8938541666666667 | 50.136 |
| 0.8938657407407408 | 50.134 |
| 0.8938773148148148 | 50.133 |
| 0.8938888888888888 | 50.134 |
| 0.893900462962963 | 50.136 |
| 0.8939120370370371 | 50.137 |
| 0.8939236111111111 | 50.137 |
| 0.8939351851851852 | 50.137 |
| 0.8939467592592593 | 50.135 |
| 0.8939583333333333 | 50.134 |
| 0.8939699074074073 | 50.132 |
| 0.8939814814814815 | 50.131 |
| 0.8939930555555556 | 50.13 |
| 0.8940046296296296 | 50.129 |
| 0.8940162037037037 | 50.128 |
| 0.8940277777777778 | 50.129 |
| 0.8940393518518519 | 50.129 |
| 0.8940509259259258 | 50.13 |
| 0.8940625 | 50.132 |
| 0.8940740740740741 | 50.134 |
| 0.8940856481481482 | 50.136 |
| 0.8940972222222222 | 50.137 |
| 0.8941087962962962 | 50.137 |
| 0.8941203703703704 | 50.138 |
| 0.8941319444444445 | 50.137 |
| 0.8941435185185185 | 50.138 |
| 0.8941550925925926 | 50.138 |
| 0.8941666666666667 | 50.135 |
| 0.8941782407407407 | 50.133 |
| 0.8941898148148147 | 50.131 |
| 0.8942013888888889 | 50.133 |
| 0.894212962962963 | 50.134 |
| 0.894224537037037 | 50.134 |
| 0.8942361111111111 | 50.133 |
| 0.8942476851851852 | 50.132 |
| 0.8942592592592593 | 50.13 |
| 0.8942708333333332 | 50.129 |
| 0.8942824074074074 | 50.13 |
| 0.8942939814814815 | 50.13 |
| 0.8943055555555556 | 50.131 |
| 0.8943171296296296 | 50.133 |
| 0.8943287037037037 | 50.133 |
| 0.8943402777777778 | 50.133 |
| 0.894351851851852 | 50.133 |
| 0.8943634259259259 | 50.132 |
| 0.894375 | 50.131 |
| 0.8943865740740741 | 50.131 |
| 0.8943981481481482 | 50.132 |
| 0.8944097222222221 | 50.133 |
| 0.8944212962962963 | 50.135 |
| 0.8944328703703704 | 50.138 |
| 0.8944444444444444 | 50.138 |
| 0.8944560185185185 | 50.138 |
| 0.8944675925925926 | 50.139 |
| 0.8944791666666667 | 50.138 |
| 0.8944907407407406 | 50.137 |
| 0.8945023148148148 | 50.137 |
| 0.8945138888888889 | 50.136 |
| 0.894525462962963 | 50.136 |
| 0.894537037037037 | 50.134 |
| 0.8945486111111111 | 50.133 |
| 0.8945601851851852 | 50.13 |
| 0.8945717592592594 | 50.128 |
| 0.8945833333333333 | 50.126 |
| 0.8945949074074074 | 50.126 |
| 0.8946064814814815 | 50.126 |
| 0.8946180555555556 | 50.124 |
| 0.8946296296296296 | 50.124 |
| 0.8946412037037037 | 50.124 |
| 0.8946527777777779 | 50.125 |
| 0.8946643518518518 | 50.127 |
| 0.8946759259259259 | 50.127 |
| 0.8946875 | 50.129 |
| 0.8946990740740741 | 50.129 |
| 0.894710648148148 | 50.128 |
| 0.8947222222222222 | 50.127 |
| 0.8947337962962963 | 50.126 |
| 0.8947453703703704 | 50.126 |
| 0.8947569444444444 | 50.127 |
| 0.8947685185185185 | 50.129 |
| 0.8947800925925926 | 50.132 |
| 0.8947916666666668 | 50.13 |
| 0.8948032407407407 | 50.13 |
| 0.8948148148148148 | 50.13 |
| 0.8948263888888889 | 50.133 |
| 0.894837962962963 | 50.135 |
| 0.894849537037037 | 50.137 |
| 0.8948611111111111 | 50.138 |
| 0.8948726851851853 | 50.137 |
| 0.8948842592592593 | 50.139 |
| 0.8948958333333333 | 50.139 |
| 0.8949074074074074 | 50.139 |
| 0.8949189814814815 | 50.138 |
| 0.8949305555555555 | 50.137 |
| 0.8949421296296296 | 50.138 |
| 0.8949537037037038 | 50.136 |
| 0.8949652777777778 | 50.134 |
| 0.8949768518518518 | 50.133 |
| 0.8949884259259259 | 50.133 |
| 0.895 | 50.134 |
| 0.8950115740740742 | 50.136 |
| 0.8950231481481481 | 50.139 |
| 0.8950347222222222 | 50.14 |
| 0.8950462962962963 | 50.14 |
| 0.8950578703703704 | 50.14 |
| 0.8950694444444444 | 50.141 |
| 0.8950810185185185 | 50.14 |
| 0.8950925925925927 | 50.141 |
| 0.8951041666666667 | 50.142 |
| 0.8951157407407407 | 50.141 |
| 0.8951273148148148 | 50.141 |
| 0.8951388888888889 | 50.141 |
| 0.8951504629629629 | 50.14 |
| 0.895162037037037 | 50.139 |
| 0.8951736111111112 | 50.14 |
| 0.8951851851851852 | 50.14 |
| 0.8951967592592592 | 50.139 |
| 0.8952083333333333 | 50.137 |
| 0.8952199074074074 | 50.135 |
| 0.8952314814814816 | 50.134 |
| 0.8952430555555555 | 50.134 |
| 0.8952546296296297 | 50.135 |
| 0.8952662037037037 | 50.134 |
| 0.8952777777777778 | 50.13 |
| 0.8952893518518518 | 50.127 |
| 0.8953009259259259 | 50.127 |
| 0.8953125000000001 | 50.127 |
| 0.8953240740740741 | 50.127 |
| 0.8953356481481481 | 50.129 |
| 0.8953472222222222 | 50.129 |
| 0.8953587962962963 | 50.131 |
| 0.8953703703703703 | 50.132 |
| 0.8953819444444444 | 50.134 |
| 0.8953935185185186 | 50.138 |
| 0.8954050925925926 | 50.139 |
| 0.8954166666666666 | 50.142 |
| 0.8954282407407407 | 50.142 |
| 0.8954398148148148 | 50.144 |
| 0.895451388888889 | 50.144 |
| 0.8954629629629629 | 50.145 |
| 0.895474537037037 | 50.145 |
| 0.8954861111111111 | 50.146 |
| 0.8954976851851852 | 50.147 |
| 0.8955092592592592 | 50.147 |
| 0.8955208333333333 | 50.145 |
| 0.8955324074074075 | 50.143 |
| 0.8955439814814815 | 50.141 |
| 0.8955555555555555 | 50.139 |
| 0.8955671296296296 | 50.141 |
| 0.8955787037037037 | 50.14 |
| 0.8955902777777777 | 50.142 |
| 0.8956018518518518 | 50.141 |
| 0.895613425925926 | 50.139 |
| 0.895625 | 50.136 |
| 0.895636574074074 | 50.132 |
| 0.8956481481481481 | 50.13 |
| 0.8956597222222222 | 50.128 |
| 0.8956712962962964 | 50.128 |
| 0.8956828703703703 | 50.129 |
| 0.8956944444444445 | 50.129 |
| 0.8957060185185185 | 50.13 |
| 0.8957175925925926 | 50.13 |
| 0.8957291666666666 | 50.13 |
| 0.8957407407407407 | 50.13 |
| 0.8957523148148149 | 50.131 |
| 0.8957638888888889 | 50.131 |
| 0.895775462962963 | 50.13 |
| 0.895787037037037 | 50.13 |
| 0.8957986111111111 | 50.129 |
| 0.8958101851851853 | 50.128 |
| 0.8958217592592592 | 50.128 |
| 0.8958333333333334 | 50.128 |
| 0.8958449074074074 | 50.127 |
| 0.8958564814814814 | 50.126 |
| 0.8958680555555555 | 50.127 |
| 0.8958796296296296 | 50.127 |
| 0.8958912037037038 | 50.127 |
| 0.8959027777777777 | 50.123 |
| 0.8959143518518519 | 50.121 |
| 0.8959259259259259 | 50.118 |
| 0.8959375 | 50.116 |
| 0.895949074074074 | 50.113 |
| 0.8959606481481481 | 50.111 |
| 0.8959722222222223 | 50.108 |
| 0.8959837962962963 | 50.106 |
| 0.8959953703703704 | 50.102 |
| 0.8960069444444444 | 50.102 |
| 0.8960185185185185 | 50.101 |
| 0.8960300925925927 | 50.102 |
| 0.8960416666666666 | 50.103 |
| 0.8960532407407408 | 50.106 |
| 0.8960648148148148 | 50.109 |
| 0.896076388888889 | 50.112 |
| 0.8960879629629629 | 50.114 |
| 0.896099537037037 | 50.117 |
| 0.8961111111111112 | 50.119 |
| 0.8961226851851851 | 50.12 |
| 0.8961342592592593 | 50.121 |
| 0.8961458333333333 | 50.121 |
| 0.8961574074074075 | 50.123 |
| 0.8961689814814814 | 50.125 |
| 0.8961805555555555 | 50.126 |
| 0.8961921296296297 | 50.126 |
| 0.8962037037037037 | 50.126 |
| 0.8962152777777778 | 50.125 |
| 0.8962268518518518 | 50.123 |
| 0.896238425925926 | 50.123 |
| 0.8962500000000001 | 50.123 |
| 0.896261574074074 | 50.121 |
| 0.8962731481481482 | 50.12 |
| 0.8962847222222222 | 50.119 |
| 0.8962962962962964 | 50.12 |
| 0.8963078703703703 | 50.12 |
| 0.8963194444444444 | 50.118 |
| 0.8963310185185186 | 50.118 |
| 0.8963425925925925 | 50.118 |
| 0.8963541666666667 | 50.118 |
| 0.8963657407407407 | 50.118 |
| 0.8963773148148149 | 50.117 |
| 0.8963888888888888 | 50.117 |
| 0.8964004629629629 | 50.116 |
| 0.8964120370370371 | 50.114 |
| 0.8964236111111111 | 50.113 |
| 0.8964351851851852 | 50.11 |
| 0.8964467592592592 | 50.106 |
| 0.8964583333333334 | 50.103 |
| 0.8964699074074075 | 50.101 |
| 0.8964814814814814 | 50.102 |
| 0.8964930555555556 | 50.103 |
| 0.8965046296296296 | 50.103 |
| 0.8965162037037038 | 50.105 |
| 0.8965277777777777 | 50.106 |
| 0.8965393518518519 | 50.106 |
| 0.896550925925926 | 50.106 |
| 0.8965624999999999 | 50.107 |
| 0.8965740740740741 | 50.108 |
| 0.8965856481481481 | 50.108 |
| 0.8965972222222223 | 50.105 |
| 0.8966087962962962 | 50.101 |
| 0.8966203703703703 | 50.099 |
| 0.8966319444444445 | 50.098 |
| 0.8966435185185185 | 50.098 |
| 0.8966550925925926 | 50.099 |
| 0.8966666666666666 | 50.099 |
| 0.8966782407407408 | 50.1 |
| 0.8966898148148149 | 50.099 |
| 0.8967013888888888 | 50.1 |
| 0.896712962962963 | 50.101 |
| 0.896724537037037 | 50.101 |
| 0.8967361111111112 | 50.103 |
| 0.8967476851851851 | 50.104 |
| 0.8967592592592593 | 50.104 |
| 0.8967708333333334 | 50.104 |
| 0.8967824074074073 | 50.104 |
| 0.8967939814814815 | 50.106 |
| 0.8968055555555555 | 50.106 |
| 0.8968171296296297 | 50.106 |
| 0.8968287037037036 | 50.107 |
| 0.8968402777777778 | 50.107 |
| 0.8968518518518519 | 50.106 |
| 0.8968634259259259 | 50.105 |
| 0.896875 | 50.105 |
| 0.896886574074074 | 50.105 |
| 0.8968981481481482 | 50.104 |
| 0.8969097222222223 | 50.104 |
| 0.8969212962962962 | 50.104 |
| 0.8969328703703704 | 50.104 |
| 0.8969444444444444 | 50.104 |
| 0.8969560185185186 | 50.105 |
| 0.8969675925925925 | 50.105 |
| 0.8969791666666667 | 50.107 |
| 0.8969907407407408 | 50.107 |
| 0.8970023148148148 | 50.107 |
| 0.8970138888888889 | 50.106 |
| 0.8970254629629629 | 50.106 |
| 0.8970370370370371 | 50.104 |
| 0.897048611111111 | 50.101 |
| 0.8970601851851852 | 50.104 |
| 0.8970717592592593 | 50.104 |
| 0.8970833333333333 | 50.104 |
| 0.8970949074074074 | 50.104 |
| 0.8971064814814814 | 50.105 |
| 0.8971180555555556 | 50.106 |
| 0.8971296296296297 | 50.109 |
| 0.8971412037037036 | 50.113 |
| 0.8971527777777778 | 50.117 |
| 0.8971643518518518 | 50.119 |
| 0.897175925925926 | 50.12 |
| 0.8971874999999999 | 50.118 |
| 0.8971990740740741 | 50.118 |
| 0.8972106481481482 | 50.117 |
| 0.8972222222222223 | 50.116 |
| 0.8972337962962963 | 50.117 |
| 0.8972453703703703 | 50.118 |
| 0.8972569444444445 | 50.119 |
| 0.8972685185185186 | 50.119 |
| 0.8972800925925926 | 50.118 |
| 0.8972916666666667 | 50.118 |
| 0.8973032407407407 | 50.116 |
| 0.8973148148148148 | 50.113 |
| 0.8973263888888888 | 50.113 |
| 0.897337962962963 | 50.112 |
| 0.8973495370370371 | 50.112 |
| 0.897361111111111 | 50.113 |
| 0.8973726851851852 | 50.113 |
| 0.8973842592592592 | 50.114 |
| 0.8973958333333334 | 50.115 |
| 0.8974074074074073 | 50.115 |
| 0.8974189814814815 | 50.114 |
| 0.8974305555555556 | 50.114 |
| 0.8974421296296297 | 50.112 |
| 0.8974537037037037 | 50.111 |
| 0.8974652777777777 | 50.108 |
| 0.8974768518518519 | 50.104 |
| 0.897488425925926 | 50.101 |
| 0.8975 | 50.099 |
| 0.8975115740740741 | 50.099 |
| 0.8975231481481482 | 50.097 |
| 0.8975347222222222 | 50.097 |
| 0.8975462962962962 | 50.099 |
| 0.8975578703703704 | 50.102 |
| 0.8975694444444445 | 50.103 |
| 0.8975810185185185 | 50.104 |
| 0.8975925925925926 | 50.103 |
| 0.8976041666666666 | 50.103 |
| 0.8976157407407408 | 50.104 |
| 0.8976273148148147 | 50.105 |
| 0.8976388888888889 | 50.105 |
| 0.897650462962963 | 50.106 |
| 0.8976620370370371 | 50.108 |
| 0.8976736111111111 | 50.11 |
| 0.8976851851851851 | 50.11 |
| 0.8976967592592593 | 50.114 |
| 0.8977083333333334 | 50.116 |
| 0.8977199074074074 | 50.12 |
| 0.8977314814814815 | 50.123 |
| 0.8977430555555556 | 50.127 |
| 0.8977546296296296 | 50.13 |
| 0.8977662037037036 | 50.13 |
| 0.8977777777777778 | 50.131 |
| 0.8977893518518519 | 50.129 |
| 0.8978009259259259 | 50.128 |
| 0.8978125 | 50.125 |
| 0.897824074074074 | 50.124 |
| 0.8978356481481482 | 50.125 |
| 0.8978472222222221 | 50.124 |
| 0.8978587962962963 | 50.125 |
| 0.8978703703703704 | 50.124 |
| 0.8978819444444445 | 50.124 |
| 0.8978935185185185 | 50.124 |
| 0.8979050925925925 | 50.124 |
| 0.8979166666666667 | 50.122 |
| 0.8979282407407408 | 50.12 |
| 0.8979398148148148 | 50.118 |
| 0.8979513888888889 | 50.117 |
| 0.897962962962963 | 50.116 |
| 0.897974537037037 | 50.114 |
| 0.897986111111111 | 50.114 |
| 0.8979976851851852 | 50.113 |
| 0.8980092592592593 | 50.113 |
| 0.8980208333333333 | 50.113 |
| 0.8980324074074074 | 50.115 |
| 0.8980439814814815 | 50.117 |
| 0.8980555555555556 | 50.121 |
| 0.8980671296296295 | 50.121 |
| 0.8980787037037037 | 50.125 |
| 0.8980902777777778 | 50.127 |
| 0.8981018518518519 | 50.13 |
| 0.8981134259259259 | 50.132 |
| 0.898125 | 50.134 |
| 0.8981365740740741 | 50.133 |
| 0.8981481481481483 | 50.132 |
| 0.8981597222222222 | 50.132 |
| 0.8981712962962963 | 50.132 |
| 0.8981828703703704 | 50.133 |
| 0.8981944444444444 | 50.134 |
| 0.8982060185185184 | 50.133 |
| 0.8982175925925926 | 50.135 |
| 0.8982291666666667 | 50.136 |
| 0.8982407407407407 | 50.138 |
| 0.8982523148148148 | 50.138 |
| 0.8982638888888889 | 50.136 |
| 0.898275462962963 | 50.135 |
| 0.8982870370370369 | 50.134 |
| 0.8982986111111111 | 50.132 |
| 0.8983101851851852 | 50.131 |
| 0.8983217592592593 | 50.13 |
| 0.8983333333333333 | 50.13 |
| 0.8983449074074074 | 50.129 |
| 0.8983564814814815 | 50.127 |
| 0.8983680555555557 | 50.126 |
| 0.8983796296296296 | 50.124 |
| 0.8983912037037037 | 50.122 |
| 0.8984027777777778 | 50.119 |
| 0.8984143518518519 | 50.117 |
| 0.8984259259259259 | 50.113 |
| 0.8984375 | 50.11 |
| 0.8984490740740741 | 50.109 |
| 0.8984606481481481 | 50.106 |
| 0.8984722222222222 | 50.101 |
| 0.8984837962962963 | 50.102 |
| 0.8984953703703704 | 50.102 |
| 0.8985069444444443 | 50.103 |
| 0.8985185185185185 | 50.105 |
| 0.8985300925925926 | 50.106 |
| 0.8985416666666667 | 50.106 |
| 0.8985532407407407 | 50.106 |
| 0.8985648148148148 | 50.108 |
| 0.8985763888888889 | 50.109 |
| 0.8985879629629631 | 50.111 |
| 0.898599537037037 | 50.114 |
| 0.8986111111111111 | 50.117 |
| 0.8986226851851852 | 50.118 |
| 0.8986342592592593 | 50.117 |
| 0.8986458333333333 | 50.118 |
| 0.8986574074074074 | 50.117 |
| 0.8986689814814816 | 50.116 |
| 0.8986805555555556 | 50.116 |
| 0.8986921296296296 | 50.115 |
| 0.8987037037037037 | 50.117 |
| 0.8987152777777778 | 50.119 |
| 0.8987268518518517 | 50.12 |
| 0.8987384259259259 | 50.122 |
| 0.89875 | 50.123 |
| 0.8987615740740741 | 50.126 |
| 0.8987731481481481 | 50.129 |
| 0.8987847222222222 | 50.132 |
| 0.8987962962962963 | 50.134 |
| 0.8988078703703705 | 50.134 |
| 0.8988194444444444 | 50.133 |
| 0.8988310185185185 | 50.133 |
| 0.8988425925925926 | 50.131 |
| 0.8988541666666667 | 50.128 |
| 0.8988657407407407 | 50.126 |
| 0.8988773148148148 | 50.125 |
| 0.898888888888889 | 50.124 |
| 0.898900462962963 | 50.121 |
| 0.898912037037037 | 50.119 |
| 0.8989236111111111 | 50.121 |
| 0.8989351851851852 | 50.123 |
| 0.8989467592592592 | 50.125 |
| 0.8989583333333333 | 50.127 |
| 0.8989699074074075 | 50.134 |
| 0.8989814814814815 | 50.138 |
| 0.8989930555555555 | 50.141 |
| 0.8990046296296296 | 50.144 |
| 0.8990162037037037 | 50.144 |
| 0.8990277777777779 | 50.144 |
| 0.8990393518518518 | 50.143 |
| 0.899050925925926 | 50.142 |
| 0.8990625 | 50.141 |
| 0.8990740740740741 | 50.143 |
| 0.8990856481481481 | 50.145 |
| 0.8990972222222222 | 50.147 |
| 0.8991087962962964 | 50.149 |
| 0.8991203703703704 | 50.151 |
| 0.8991319444444444 | 50.153 |
| 0.8991435185185185 | 50.154 |
| 0.8991550925925926 | 50.154 |
| 0.8991666666666666 | 50.155 |
| 0.8991782407407407 | 50.156 |
| 0.8991898148148149 | 50.157 |
| 0.8992013888888889 | 50.157 |
| 0.8992129629629629 | 50.157 |
| 0.899224537037037 | 50.159 |
| 0.8992361111111111 | 50.161 |
| 0.8992476851851853 | 50.162 |
| 0.8992592592592592 | 50.164 |
| 0.8992708333333334 | 50.162 |
| 0.8992824074074074 | 50.162 |
| 0.8992939814814815 | 50.165 |
| 0.8993055555555555 | 50.165 |
| 0.8993171296296296 | 50.165 |
| 0.8993287037037038 | 50.163 |
| 0.8993402777777778 | 50.163 |
| 0.8993518518518518 | 50.163 |
| 0.8993634259259259 | 50.163 |
| 0.899375 | 50.164 |
| 0.899386574074074 | 50.163 |
| 0.8993981481481481 | 50.162 |
| 0.8994097222222223 | 50.162 |
| 0.8994212962962963 | 50.163 |
| 0.8994328703703703 | 50.165 |
| 0.8994444444444444 | 50.167 |
| 0.8994560185185185 | 50.17 |
| 0.8994675925925927 | 50.172 |
| 0.8994791666666666 | 50.174 |
| 0.8994907407407408 | 50.175 |
| 0.8995023148148148 | 50.176 |
| 0.899513888888889 | 50.178 |
| 0.8995254629629629 | 50.18 |
| 0.899537037037037 | 50.182 |
| 0.8995486111111112 | 50.183 |
| 0.8995601851851852 | 50.185 |
| 0.8995717592592593 | 50.185 |
| 0.8995833333333333 | 50.183 |
| 0.8995949074074074 | 50.183 |
| 0.8996064814814814 | 50.179 |
| 0.8996180555555555 | 50.175 |
| 0.8996296296296297 | 50.171 |
| 0.8996412037037037 | 50.167 |
| 0.8996527777777777 | 50.164 |
| 0.8996643518518518 | 50.161 |
| 0.8996759259259259 | 50.16 |
| 0.8996875000000001 | 50.158 |
| 0.899699074074074 | 50.158 |
| 0.8997106481481482 | 50.16 |
| 0.8997222222222222 | 50.161 |
| 0.8997337962962964 | 50.159 |
| 0.8997453703703703 | 50.158 |
| 0.8997569444444444 | 50.159 |
| 0.8997685185185186 | 50.16 |
| 0.8997800925925926 | 50.161 |
| 0.8997916666666667 | 50.161 |
| 0.8998032407407407 | 50.161 |
| 0.8998148148148148 | 50.163 |
| 0.899826388888889 | 50.163 |
| 0.8998379629629629 | 50.164 |
| 0.8998495370370371 | 50.165 |
| 0.8998611111111111 | 50.167 |
| 0.8998726851851853 | 50.168 |
| 0.8998842592592592 | 50.169 |
| 0.8998958333333333 | 50.169 |
| 0.8999074074074075 | 50.166 |
| 0.8999189814814814 | 50.165 |
| 0.8999305555555556 | 50.163 |
| 0.8999421296296296 | 50.162 |
| 0.8999537037037038 | 50.161 |
| 0.8999652777777777 | 50.159 |
| 0.8999768518518518 | 50.157 |
| 0.899988425925926 | 50.156 |
| 0.9 | 50.156 |
| 0.9000115740740741 | 50.157 |
| 0.9000231481481481 | 50.157 |
| 0.9000347222222222 | 50.157 |
| 0.9000462962962964 | 50.157 |
| 0.9000578703703703 | 50.158 |
| 0.9000694444444445 | 50.16 |
| 0.9000810185185185 | 50.162 |
| 0.9000925925925927 | 50.16 |
| 0.9001041666666666 | 50.158 |
| 0.9001157407407407 | 50.154 |
| 0.9001273148148149 | 50.151 |
| 0.9001388888888888 | 50.147 |
| 0.900150462962963 | 50.145 |
| 0.900162037037037 | 50.142 |
| 0.9001736111111112 | 50.139 |
| 0.9001851851851851 | 50.136 |
| 0.9001967592592592 | 50.132 |
| 0.9002083333333334 | 50.131 |
| 0.9002199074074074 | 50.129 |
| 0.9002314814814815 | 50.126 |
| 0.9002430555555555 | 50.123 |
| 0.9002546296296297 | 50.121 |
| 0.9002662037037038 | 50.119 |
| 0.9002777777777777 | 50.116 |
| 0.9002893518518519 | 50.115 |
| 0.9003009259259259 | 50.113 |
| 0.9003125000000001 | 50.112 |
| 0.900324074074074 | 50.112 |
| 0.9003356481481481 | 50.113 |
| 0.9003472222222223 | 50.113 |
| 0.9003587962962962 | 50.114 |
| 0.9003703703703704 | 50.115 |
| 0.9003819444444444 | 50.116 |
| 0.9003935185185186 | 50.118 |
| 0.9004050925925925 | 50.119 |
| 0.9004166666666666 | 50.119 |
| 0.9004282407407408 | 50.119 |
| 0.9004398148148148 | 50.119 |
| 0.9004513888888889 | 50.12 |
| 0.9004629629629629 | 50.124 |
| 0.9004745370370371 | 50.126 |
| 0.9004861111111112 | 50.127 |
| 0.9004976851851851 | 50.129 |
| 0.9005092592592593 | 50.128 |
| 0.9005208333333333 | 50.127 |
| 0.9005324074074075 | 50.126 |
| 0.9005439814814814 | 50.125 |
| 0.9005555555555556 | 50.123 |
| 0.9005671296296297 | 50.122 |
| 0.9005787037037036 | 50.119 |
| 0.9005902777777778 | 50.118 |
| 0.9006018518518518 | 50.117 |
| 0.900613425925926 | 50.118 |
| 0.9006249999999999 | 50.12 |
| 0.900636574074074 | 50.121 |
| 0.9006481481481482 | 50.123 |
| 0.9006597222222222 | 50.123 |
| 0.9006712962962963 | 50.124 |
| 0.9006828703703703 | 50.124 |
| 0.9006944444444445 | 50.123 |
| 0.9007060185185186 | 50.122 |
| 0.9007175925925925 | 50.121 |
| 0.9007291666666667 | 50.12 |
| 0.9007407407407407 | 50.121 |
| 0.9007523148148149 | 50.119 |
| 0.9007638888888888 | 50.12 |
| 0.900775462962963 | 50.12 |
| 0.9007870370370371 | 50.121 |
| 0.900798611111111 | 50.121 |
| 0.9008101851851852 | 50.122 |
| 0.9008217592592592 | 50.123 |
| 0.9008333333333334 | 50.125 |
| 0.9008449074074073 | 50.126 |
| 0.9008564814814815 | 50.127 |
| 0.9008680555555556 | 50.125 |
| 0.9008796296296296 | 50.124 |
| 0.9008912037037037 | 50.125 |
| 0.9009027777777777 | 50.126 |
| 0.9009143518518519 | 50.127 |
| 0.900925925925926 | 50.127 |
| 0.9009375 | 50.126 |
| 0.9009490740740741 | 50.127 |
| 0.9009606481481481 | 50.128 |
| 0.9009722222222223 | 50.129 |
| 0.9009837962962962 | 50.129 |
| 0.9009953703703704 | 50.129 |
| 0.9010069444444445 | 50.13 |
| 0.9010185185185186 | 50.13 |
| 0.9010300925925926 | 50.128 |
| 0.9010416666666666 | 50.128 |
| 0.9010532407407408 | 50.126 |
| 0.9010648148148147 | 50.126 |
| 0.9010763888888889 | 50.124 |
| 0.901087962962963 | 50.121 |
| 0.901099537037037 | 50.117 |
| 0.9011111111111111 | 50.113 |
| 0.9011226851851851 | 50.108 |
| 0.9011342592592593 | 50.107 |
| 0.9011458333333334 | 50.106 |
| 0.9011574074074074 | 50.105 |
| 0.9011689814814815 | 50.102 |
| 0.9011805555555555 | 50.098 |
| 0.9011921296296297 | 50.096 |
| 0.9012037037037036 | 50.095 |
| 0.9012152777777778 | 50.097 |
| 0.9012268518518519 | 50.097 |
| 0.901238425925926 | 50.097 |
| 0.90125 | 50.098 |
| 0.901261574074074 | 50.098 |
| 0.9012731481481482 | 50.097 |
| 0.9012847222222223 | 50.095 |
| 0.9012962962962963 | 50.092 |
| 0.9013078703703704 | 50.091 |
| 0.9013194444444445 | 50.091 |
| 0.9013310185185185 | 50.092 |
| 0.9013425925925925 | 50.091 |
| 0.9013541666666667 | 50.092 |
| 0.9013657407407408 | 50.091 |
| 0.9013773148148148 | 50.091 |
| 0.9013888888888889 | 50.091 |
| 0.901400462962963 | 50.092 |
| 0.9014120370370371 | 50.09 |
| 0.901423611111111 | 50.089 |
| 0.9014351851851852 | 50.088 |
| 0.9014467592592593 | 50.087 |
| 0.9014583333333334 | 50.084 |
| 0.9014699074074074 | 50.081 |
| 0.9014814814814814 | 50.08 |
| 0.9014930555555556 | 50.08 |
| 0.9015046296296297 | 50.08 |
| 0.9015162037037037 | 50.078 |
| 0.9015277777777778 | 50.076 |
| 0.9015393518518519 | 50.072 |
| 0.9015509259259259 | 50.07 |
| 0.9015624999999999 | 50.069 |
| 0.9015740740740741 | 50.069 |
| 0.9015856481481482 | 50.069 |
| 0.9015972222222222 | 50.072 |
| 0.9016087962962963 | 50.075 |
| 0.9016203703703703 | 50.077 |
| 0.9016319444444445 | 50.078 |
| 0.9016435185185184 | 50.077 |
| 0.9016550925925926 | 50.076 |
| 0.9016666666666667 | 50.076 |
| 0.9016782407407408 | 50.076 |
| 0.9016898148148148 | 50.074 |
| 0.9017013888888888 | 50.071 |
| 0.901712962962963 | 50.068 |
| 0.9017245370370371 | 50.067 |
| 0.9017361111111111 | 50.067 |
| 0.9017476851851852 | 50.066 |
| 0.9017592592592593 | 50.065 |
| 0.9017708333333333 | 50.064 |
| 0.9017824074074073 | 50.064 |
| 0.9017939814814815 | 50.064 |
| 0.9018055555555556 | 50.064 |
| 0.9018171296296296 | 50.06 |
| 0.9018287037037037 | 50.057 |
| 0.9018402777777778 | 50.053 |
| 0.9018518518518519 | 50.05 |
| 0.9018634259259258 | 50.044 |
| 0.901875 | 50.04 |
| 0.9018865740740741 | 50.036 |
| 0.9018981481481482 | 50.032 |
| 0.9019097222222222 | 50.03 |
| 0.9019212962962962 | 50.027 |
| 0.9019328703703704 | 50.026 |
| 0.9019444444444445 | 50.026 |
| 0.9019560185185185 | 50.026 |
| 0.9019675925925926 | 50.025 |
| 0.9019791666666667 | 50.024 |
| 0.9019907407407407 | 50.024 |
| 0.9020023148148147 | 50.024 |
| 0.9020138888888889 | 50.022 |
| 0.902025462962963 | 50.02 |
| 0.902037037037037 | 50.02 |
| 0.9020486111111111 | 50.018 |
| 0.9020601851851852 | 50.015 |
| 0.9020717592592593 | 50.014 |
| 0.9020833333333332 | 50.012 |
| 0.9020949074074074 | 50.011 |
| 0.9021064814814815 | 50.01 |
| 0.9021180555555556 | 50.009 |
| 0.9021296296296296 | 50.01 |
| 0.9021412037037037 | 50.011 |
| 0.9021527777777778 | 50.013 |
| 0.902164351851852 | 50.016 |
| 0.9021759259259259 | 50.017 |
| 0.9021875 | 50.016 |
| 0.9021990740740741 | 50.016 |
| 0.9022106481481481 | 50.013 |
| 0.9022222222222221 | 50.011 |
| 0.9022337962962963 | 50.008 |
| 0.9022453703703704 | 50.006 |
| 0.9022569444444444 | 50.004 |
| 0.9022685185185185 | 50.002 |
| 0.9022800925925926 | 49.999 |
| 0.9022916666666667 | 49.998 |
| 0.9023032407407406 | 49.997 |
| 0.9023148148148148 | 49.995 |
| 0.9023263888888889 | 49.993 |
| 0.902337962962963 | 49.992 |
| 0.902349537037037 | 49.989 |
| 0.9023611111111111 | 49.986 |
| 0.9023726851851852 | 49.982 |
| 0.9023842592592594 | 49.979 |
| 0.9023958333333333 | 49.976 |
| 0.9024074074074074 | 49.974 |
| 0.9024189814814815 | 49.974 |
| 0.9024305555555556 | 49.973 |
| 0.9024421296296296 | 49.974 |
| 0.9024537037037037 | 49.977 |
| 0.9024652777777779 | 49.977 |
| 0.9024768518518519 | 49.976 |
| 0.9024884259259259 | 49.975 |
| 0.9025 | 49.972 |
| 0.9025115740740741 | 49.969 |
| 0.902523148148148 | 49.965 |
| 0.9025347222222222 | 49.962 |
| 0.9025462962962963 | 49.962 |
| 0.9025578703703704 | 49.96 |
| 0.9025694444444444 | 49.959 |
| 0.9025810185185185 | 49.958 |
| 0.9025925925925926 | 49.957 |
| 0.9026041666666668 | 49.955 |
| 0.9026157407407407 | 49.955 |
| 0.9026273148148148 | 49.956 |
| 0.9026388888888889 | 49.957 |
| 0.902650462962963 | 49.958 |
| 0.902662037037037 | 49.96 |
| 0.9026736111111111 | 49.961 |
| 0.9026851851851853 | 49.962 |
| 0.9026967592592593 | 49.961 |
| 0.9027083333333333 | 49.961 |
| 0.9027199074074074 | 49.962 |
| 0.9027314814814815 | 49.962 |
| 0.9027430555555555 | 49.963 |
| 0.9027546296296296 | 49.961 |
| 0.9027662037037038 | 49.961 |
| 0.9027777777777778 | 49.961 |
| 0.9027893518518518 | 49.961 |
| 0.9028009259259259 | 49.961 |
| 0.9028125 | 49.959 |
| 0.9028240740740742 | 49.957 |
| 0.9028356481481481 | 49.956 |
| 0.9028472222222222 | 49.954 |
| 0.9028587962962963 | 49.952 |
| 0.9028703703703704 | 49.951 |
| 0.9028819444444444 | 49.952 |
| 0.9028935185185185 | 49.954 |
| 0.9029050925925927 | 49.956 |
| 0.9029166666666667 | 49.959 |
| 0.9029282407407407 | 49.96 |
| 0.9029398148148148 | 49.962 |
| 0.9029513888888889 | 49.964 |
| 0.9029629629629629 | 49.964 |
| 0.902974537037037 | 49.963 |
| 0.9029861111111112 | 49.964 |
| 0.9029976851851852 | 49.965 |
| 0.9030092592592592 | 49.967 |
| 0.9030208333333333 | 49.967 |
| 0.9030324074074074 | 49.969 |
| 0.9030439814814816 | 49.971 |
| 0.9030555555555555 | 49.972 |
| 0.9030671296296297 | 49.973 |
| 0.9030787037037037 | 49.972 |
| 0.9030902777777778 | 49.973 |
| 0.9031018518518518 | 49.973 |
| 0.9031134259259259 | 49.972 |
| 0.9031250000000001 | 49.972 |
| 0.9031365740740741 | 49.97 |
| 0.9031481481481481 | 49.968 |
| 0.9031597222222222 | 49.967 |
| 0.9031712962962963 | 49.966 |
| 0.9031828703703703 | 49.965 |
| 0.9031944444444444 | 49.965 |
| 0.9032060185185186 | 49.965 |
| 0.9032175925925926 | 49.962 |
| 0.9032291666666666 | 49.961 |
| 0.9032407407407407 | 49.959 |
| 0.9032523148148148 | 49.957 |
| 0.903263888888889 | 49.955 |
| 0.9032754629629629 | 49.953 |
| 0.903287037037037 | 49.952 |
| 0.9032986111111111 | 49.952 |
| 0.9033101851851852 | 49.953 |
| 0.9033217592592592 | 49.952 |
| 0.9033333333333333 | 49.95 |
| 0.9033449074074075 | 49.949 |
| 0.9033564814814815 | 49.945 |
| 0.9033680555555555 | 49.943 |
| 0.9033796296296296 | 49.944 |
| 0.9033912037037037 | 49.944 |
| 0.9034027777777777 | 49.945 |
| 0.9034143518518518 | 49.946 |
| 0.903425925925926 | 49.948 |
| 0.9034375 | 49.95 |
| 0.903449074074074 | 49.953 |
| 0.9034606481481481 | 49.956 |
| 0.9034722222222222 | 49.958 |
| 0.9034837962962964 | 49.959 |
| 0.9034953703703703 | 49.96 |
| 0.9035069444444445 | 49.961 |
| 0.9035185185185185 | 49.962 |
| 0.9035300925925926 | 49.961 |
| 0.9035416666666666 | 49.963 |
| 0.9035532407407407 | 49.964 |
| 0.9035648148148149 | 49.966 |
| 0.9035763888888889 | 49.966 |
| 0.903587962962963 | 49.966 |
| 0.903599537037037 | 49.966 |
| 0.9036111111111111 | 49.965 |
| 0.9036226851851853 | 49.964 |
| 0.9036342592592592 | 49.966 |
| 0.9036458333333334 | 49.966 |
| 0.9036574074074074 | 49.968 |
| 0.9036689814814814 | 49.969 |
| 0.9036805555555555 | 49.973 |
| 0.9036921296296296 | 49.976 |
| 0.9037037037037038 | 49.978 |
| 0.9037152777777777 | 49.981 |
| 0.9037268518518519 | 49.981 |
| 0.9037384259259259 | 49.982 |
| 0.90375 | 49.983 |
| 0.903761574074074 | 49.982 |
| 0.9037731481481481 | 49.981 |
| 0.9037847222222223 | 49.981 |
| 0.9037962962962963 | 49.982 |
| 0.9038078703703704 | 49.98 |
| 0.9038194444444444 | 49.982 |
| 0.9038310185185185 | 49.984 |
| 0.9038425925925927 | 49.986 |
| 0.9038541666666666 | 49.988 |
| 0.9038657407407408 | 49.989 |
| 0.9038773148148148 | 49.99 |
| 0.903888888888889 | 49.992 |
| 0.9039004629629629 | 49.993 |
| 0.903912037037037 | 49.994 |
| 0.9039236111111112 | 49.996 |
| 0.9039351851851851 | 49.998 |
| 0.9039467592592593 | 50.001 |
| 0.9039583333333333 | 50.003 |
| 0.9039699074074075 | 50.004 |
| 0.9039814814814814 | 50.003 |
| 0.9039930555555555 | 50.004 |
| 0.9040046296296297 | 50.003 |
| 0.9040162037037037 | 50 |
| 0.9040277777777778 | 49.999 |
| 0.9040393518518518 | 49.999 |
| 0.904050925925926 | 50 |
| 0.9040625000000001 | 49.999 |
| 0.904074074074074 | 49.998 |
| 0.9040856481481482 | 49.997 |
| 0.9040972222222222 | 49.998 |
| 0.9041087962962964 | 50 |
| 0.9041203703703703 | 50.003 |
| 0.9041319444444444 | 50.003 |
| 0.9041435185185186 | 50.005 |
| 0.9041550925925925 | 50.006 |
| 0.9041666666666667 | 50.009 |
| 0.9041782407407407 | 50.011 |
| 0.9041898148148149 | 50.012 |
| 0.9042013888888888 | 50.014 |
| 0.9042129629629629 | 50.016 |
| 0.9042245370370371 | 50.017 |
| 0.9042361111111111 | 50.02 |
| 0.9042476851851852 | 50.022 |
| 0.9042592592592592 | 50.024 |
| 0.9042708333333334 | 50.025 |
| 0.9042824074074075 | 50.025 |
| 0.9042939814814814 | 50.024 |
| 0.9043055555555556 | 50.021 |
| 0.9043171296296296 | 50.018 |
| 0.9043287037037038 | 50.014 |
| 0.9043402777777777 | 50.013 |
| 0.9043518518518519 | 50.013 |
| 0.904363425925926 | 50.015 |
| 0.9043749999999999 | 50.018 |
| 0.9043865740740741 | 50.02 |
| 0.9043981481481481 | 50.024 |
| 0.9044097222222223 | 50.026 |
| 0.9044212962962962 | 50.029 |
| 0.9044328703703703 | 50.032 |
| 0.9044444444444445 | 50.034 |
| 0.9044560185185185 | 50.036 |
| 0.9044675925925926 | 50.036 |
| 0.9044791666666666 | 50.037 |
| 0.9044907407407408 | 50.038 |
| 0.9045023148148149 | 50.036 |
| 0.9045138888888888 | 50.037 |
| 0.904525462962963 | 50.036 |
| 0.904537037037037 | 50.034 |
| 0.9045486111111112 | 50.034 |
| 0.9045601851851851 | 50.032 |
| 0.9045717592592593 | 50.032 |
| 0.9045833333333334 | 50.03 |
| 0.9045949074074073 | 50.03 |
| 0.9046064814814815 | 50.03 |
| 0.9046180555555555 | 50.029 |
| 0.9046296296296297 | 50.029 |
| 0.9046412037037036 | 50.03 |
| 0.9046527777777778 | 50.031 |
| 0.9046643518518519 | 50.033 |
| 0.9046759259259259 | 50.034 |
| 0.9046875 | 50.035 |
| 0.904699074074074 | 50.035 |
| 0.9047106481481482 | 50.035 |
| 0.9047222222222223 | 50.036 |
| 0.9047337962962962 | 50.039 |
| 0.9047453703703704 | 50.039 |
| 0.9047569444444444 | 50.04 |
| 0.9047685185185186 | 50.041 |
| 0.9047800925925925 | 50.043 |
| 0.9047916666666667 | 50.045 |
| 0.9048032407407408 | 50.047 |
| 0.9048148148148147 | 50.047 |
| 0.9048263888888889 | 50.048 |
| 0.9048379629629629 | 50.048 |
| 0.9048495370370371 | 50.049 |
| 0.904861111111111 | 50.048 |
| 0.9048726851851852 | 50.047 |
| 0.9048842592592593 | 50.044 |
| 0.9048958333333333 | 50.041 |
| 0.9049074074074074 | 50.04 |
| 0.9049189814814814 | 50.038 |
| 0.9049305555555556 | 50.037 |
| 0.9049421296296297 | 50.037 |
| 0.9049537037037036 | 50.036 |
| 0.9049652777777778 | 50.036 |
| 0.9049768518518518 | 50.036 |
| 0.904988425925926 | 50.037 |
| 0.9049999999999999 | 50.038 |
| 0.9050115740740741 | 50.037 |
| 0.9050231481481482 | 50.037 |
| 0.9050347222222223 | 50.037 |
| 0.9050462962962963 | 50.037 |
| 0.9050578703703703 | 50.038 |
| 0.9050694444444445 | 50.041 |
| 0.9050810185185186 | 50.042 |
| 0.9050925925925926 | 50.046 |
| 0.9051041666666667 | 50.046 |
| 0.9051157407407407 | 50.046 |
| 0.9051273148148148 | 50.048 |
| 0.9051388888888888 | 50.049 |
| 0.905150462962963 | 50.049 |
| 0.9051620370370371 | 50.048 |
| 0.905173611111111 | 50.047 |
| 0.9051851851851852 | 50.048 |
| 0.9051967592592592 | 50.048 |
| 0.9052083333333334 | 50.048 |
| 0.9052199074074073 | 50.05 |
| 0.9052314814814815 | 50.052 |
| 0.9052430555555556 | 50.054 |
| 0.9052546296296297 | 50.056 |
| 0.9052662037037037 | 50.056 |
| 0.9052777777777777 | 50.055 |
| 0.9052893518518519 | 50.054 |
| 0.905300925925926 | 50.055 |
| 0.9053125 | 50.054 |
| 0.9053240740740741 | 50.053 |
| 0.9053356481481482 | 50.05 |
| 0.9053472222222222 | 50.047 |
| 0.9053587962962962 | 50.045 |
| 0.9053703703703704 | 50.043 |
| 0.9053819444444445 | 50.043 |
| 0.9053935185185185 | 50.045 |
| 0.9054050925925926 | 50.045 |
| 0.9054166666666666 | 50.046 |
| 0.9054282407407408 | 50.047 |
| 0.9054398148148147 | 50.047 |
| 0.9054513888888889 | 50.049 |
| 0.905462962962963 | 50.05 |
| 0.9054745370370371 | 50.053 |
| 0.9054861111111111 | 50.053 |
| 0.9054976851851851 | 50.055 |
| 0.9055092592592593 | 50.056 |
| 0.9055208333333334 | 50.057 |
| 0.9055324074074074 | 50.057 |
| 0.9055439814814815 | 50.057 |
| 0.9055555555555556 | 50.054 |
| 0.9055671296296296 | 50.054 |
| 0.9055787037037036 | 50.055 |
| 0.9055902777777778 | 50.057 |
| 0.9056018518518519 | 50.058 |
| 0.9056134259259259 | 50.061 |
| 0.905625 | 50.064 |
| 0.905636574074074 | 50.063 |
| 0.9056481481481482 | 50.064 |
| 0.9056597222222221 | 50.064 |
| 0.9056712962962963 | 50.062 |
| 0.9056828703703704 | 50.06 |
| 0.9056944444444445 | 50.059 |
| 0.9057060185185185 | 50.058 |
| 0.9057175925925925 | 50.055 |
| 0.9057291666666667 | 50.051 |
| 0.9057407407407408 | 50.047 |
| 0.9057523148148148 | 50.043 |
| 0.9057638888888889 | 50.041 |
| 0.905775462962963 | 50.039 |
| 0.905787037037037 | 50.036 |
| 0.905798611111111 | 50.036 |
| 0.9058101851851852 | 50.035 |
| 0.9058217592592593 | 50.034 |
| 0.9058333333333333 | 50.034 |
| 0.9058449074074074 | 50.034 |
| 0.9058564814814815 | 50.034 |
| 0.9058680555555556 | 50.035 |
| 0.9058796296296295 | 50.035 |
| 0.9058912037037037 | 50.034 |
| 0.9059027777777778 | 50.033 |
| 0.9059143518518519 | 50.032 |
| 0.9059259259259259 | 50.03 |
| 0.9059375 | 50.03 |
| 0.9059490740740741 | 50.029 |
| 0.9059606481481483 | 50.029 |
| 0.9059722222222222 | 50.03 |
| 0.9059837962962963 | 50.032 |
| 0.9059953703703704 | 50.033 |
| 0.9060069444444444 | 50.035 |
| 0.9060185185185184 | 50.037 |
| 0.9060300925925926 | 50.036 |
| 0.9060416666666667 | 50.036 |
| 0.9060532407407407 | 50.034 |
| 0.9060648148148148 | 50.032 |
| 0.9060763888888889 | 50.031 |
| 0.906087962962963 | 50.028 |
| 0.9060995370370369 | 50.027 |
| 0.9061111111111111 | 50.029 |
| 0.9061226851851852 | 50.029 |
| 0.9061342592592593 | 50.03 |
| 0.9061458333333333 | 50.029 |
| 0.9061574074074074 | 50.028 |
| 0.9061689814814815 | 50.026 |
| 0.9061805555555557 | 50.025 |
| 0.9061921296296296 | 50.025 |
| 0.9062037037037037 | 50.023 |
| 0.9062152777777778 | 50.022 |
| 0.9062268518518519 | 50.022 |
| 0.9062384259259259 | 50.021 |